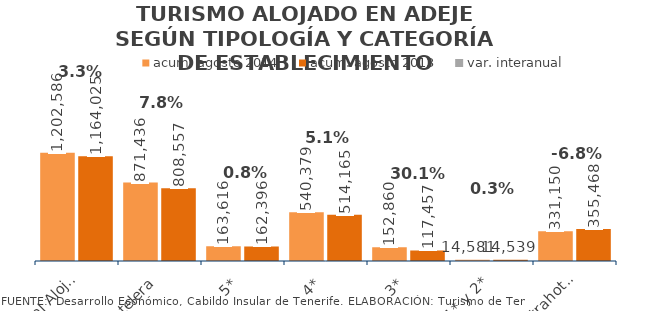
| Category | acum. agosto 2014 | acum. agosto 2013 |
|---|---|---|
| Total Alojados | 1202586 | 1164025 |
| Hotelera | 871436 | 808557 |
| 5* | 163616 | 162396 |
| 4* | 540379 | 514165 |
| 3* | 152860 | 117457 |
| 1* y 2* | 14581 | 14539 |
| Extrahotelera | 331150 | 355468 |